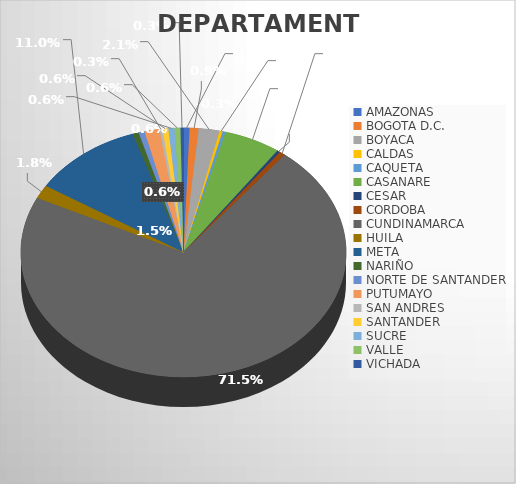
| Category | CANTIDAD |
|---|---|
| AMAZONAS | 2 |
| BOGOTA D.C. | 3 |
| BOYACA | 7 |
| CALDAS | 1 |
| CAQUETA  | 1 |
| CASANARE | 19 |
| CESAR | 1 |
| CORDOBA | 2 |
| CUNDINAMARCA | 241 |
| HUILA | 6 |
| META | 37 |
| NARIÑO | 2 |
| NORTE DE SANTANDER | 2 |
| PUTUMAYO | 5 |
| SAN ANDRES | 1 |
| SANTANDER | 2 |
| SUCRE | 2 |
| VALLE | 2 |
| VICHADA | 1 |